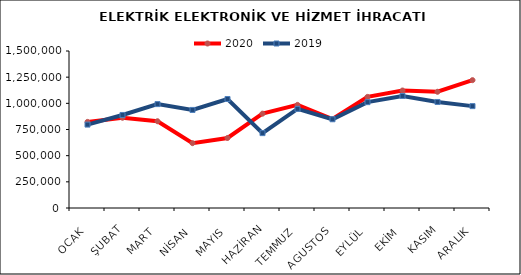
| Category | 2020 | 2019 |
|---|---|---|
| OCAK | 822634.862 | 796993.565 |
| ŞUBAT | 862550.083 | 888924.744 |
| MART | 828841.355 | 992598.811 |
| NİSAN | 619437.99 | 936996.216 |
| MAYIS | 669054.204 | 1041396.756 |
| HAZİRAN | 901316.321 | 715358.633 |
| TEMMUZ | 985272.065 | 947102.203 |
| AGUSTOS | 850046.277 | 847906.549 |
| EYLÜL | 1061481.907 | 1011369.692 |
| EKİM | 1122443.831 | 1070550.611 |
| KASIM | 1110467.52 | 1013034.502 |
| ARALIK | 1221535.576 | 973436.426 |